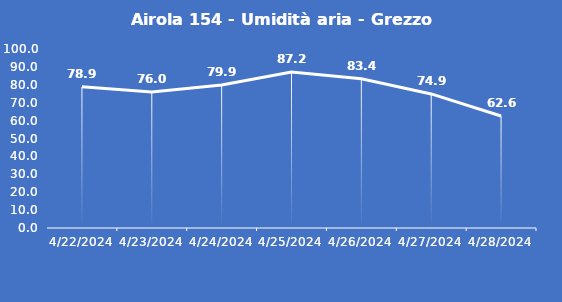
| Category | Airola 154 - Umidità aria - Grezzo (%) |
|---|---|
| 4/22/24 | 78.9 |
| 4/23/24 | 76 |
| 4/24/24 | 79.9 |
| 4/25/24 | 87.2 |
| 4/26/24 | 83.4 |
| 4/27/24 | 74.9 |
| 4/28/24 | 62.6 |